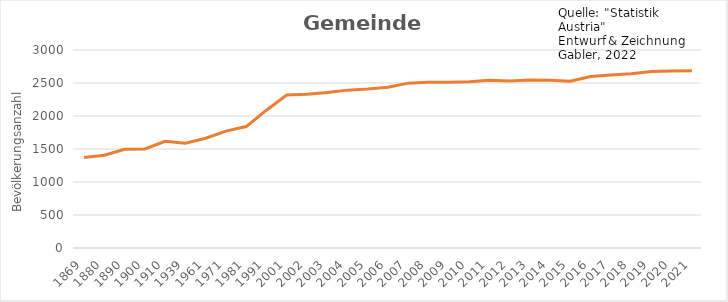
| Category | Gemeinde Euratsfeld |
|---|---|
| 1869 | 1371 |
| 1880 | 1405 |
| 1890 | 1496 |
| 1900 | 1501 |
| 1910 | 1616 |
| 1939 | 1587 |
| 1961 | 1663 |
| 1971 | 1771 |
| 1981 | 1840 |
| 1991 | 2088 |
| 2001 | 2319 |
| 2002 | 2330 |
| 2003 | 2356 |
| 2004 | 2392 |
| 2005 | 2409 |
| 2006 | 2437 |
| 2007 | 2498 |
| 2008 | 2510 |
| 2009 | 2511 |
| 2010 | 2518 |
| 2011 | 2541 |
| 2012 | 2532 |
| 2013 | 2545 |
| 2014 | 2543 |
| 2015 | 2526 |
| 2016 | 2598 |
| 2017 | 2620 |
| 2018 | 2639 |
| 2019 | 2674 |
| 2020 | 2680 |
| 2021 | 2686 |